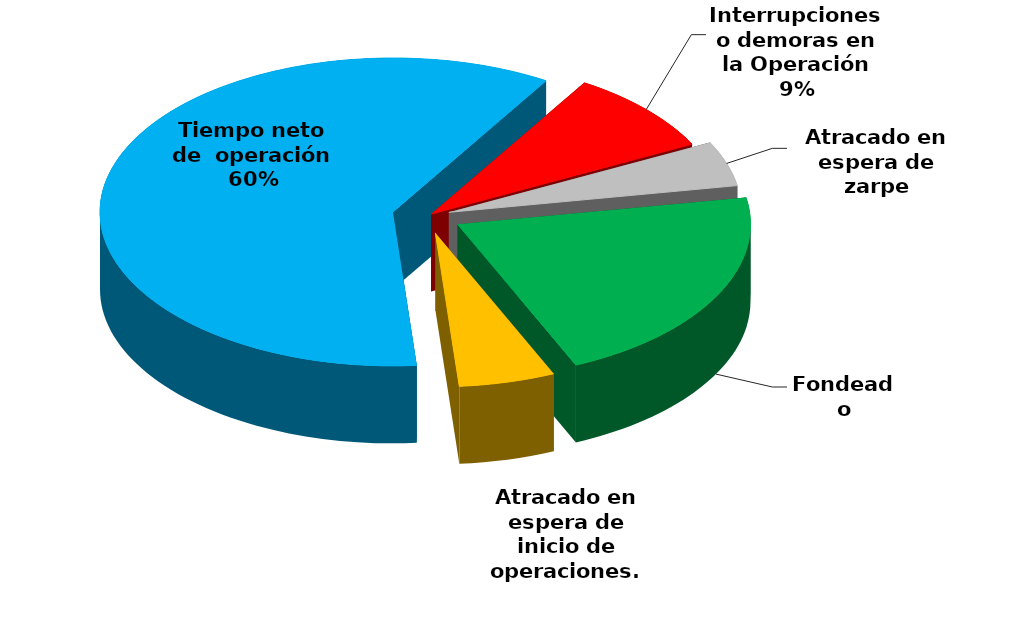
| Category | Series 0 |
|---|---|
| Fondeado | 22201.407 |
| Atracado en espera de inicio de operaciones. | 5579.893 |
| Tiempo neto de  operación | 63016.185 |
| Interrupciones o demoras en la Operación | 9169.92 |
| Atracado en espera de zarpe | 4956.389 |